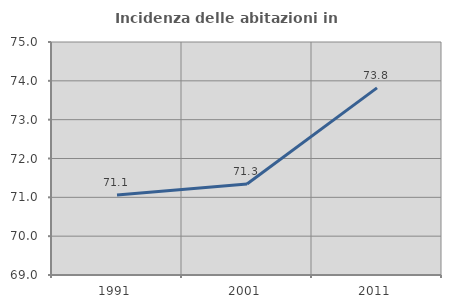
| Category | Incidenza delle abitazioni in proprietà  |
|---|---|
| 1991.0 | 71.062 |
| 2001.0 | 71.345 |
| 2011.0 | 73.819 |